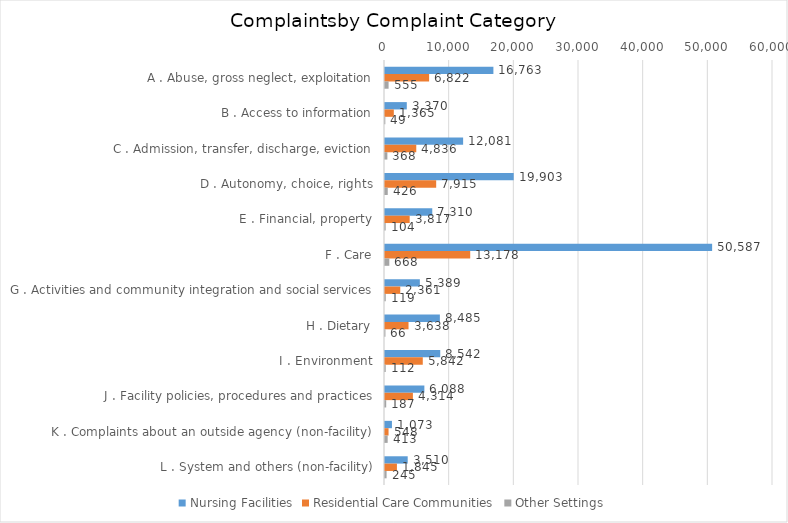
| Category | Nursing Facilities | Residential Care Communities | Other Settings |
|---|---|---|---|
| A . Abuse, gross neglect, exploitation | 16763 | 6822 | 555 |
| B . Access to information | 3370 | 1365 | 49 |
| C . Admission, transfer, discharge, eviction | 12081 | 4836 | 368 |
| D . Autonomy, choice, rights | 19903 | 7915 | 426 |
| E . Financial, property | 7310 | 3817 | 104 |
| F . Care | 50587 | 13178 | 668 |
| G . Activities and community integration and social services | 5389 | 2361 | 119 |
| H . Dietary | 8485 | 3638 | 66 |
| I . Environment | 8542 | 5842 | 112 |
| J . Facility policies, procedures and practices | 6088 | 4314 | 187 |
| K . Complaints about an outside agency (non-facility) | 1073 | 548 | 413 |
| L . System and others (non-facility) | 3510 | 1845 | 245 |